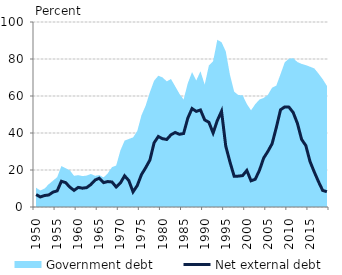
| Category | Net external debt |
|---|---|
| 1950.0 | 6.728 |
| 1951.0 | 5.438 |
| 1952.0 | 6.2 |
| 1953.0 | 6.504 |
| 1954.0 | 8.04 |
| 1955.0 | 8.719 |
| 1956.0 | 13.915 |
| 1957.0 | 13.187 |
| 1958.0 | 10.752 |
| 1959.0 | 8.988 |
| 1960.0 | 10.599 |
| 1961.0 | 10.168 |
| 1962.0 | 10.481 |
| 1963.0 | 12.162 |
| 1964.0 | 14.583 |
| 1965.0 | 15.564 |
| 1966.0 | 13.183 |
| 1967.0 | 13.754 |
| 1968.0 | 13.516 |
| 1969.0 | 10.821 |
| 1970.0 | 12.98 |
| 1971.0 | 16.852 |
| 1972.0 | 14.275 |
| 1973.0 | 8.183 |
| 1974.0 | 11.578 |
| 1975.0 | 17.5 |
| 1976.0 | 21.258 |
| 1977.0 | 25.358 |
| 1978.0 | 34.735 |
| 1979.0 | 38.098 |
| 1980.0 | 36.929 |
| 1981.0 | 36.501 |
| 1982.0 | 39.034 |
| 1983.0 | 40.288 |
| 1984.0 | 39.305 |
| 1985.0 | 39.724 |
| 1986.0 | 48.084 |
| 1987.0 | 53.224 |
| 1988.0 | 51.699 |
| 1989.0 | 52.465 |
| 1990.0 | 47.076 |
| 1991.0 | 45.805 |
| 1992.0 | 40.021 |
| 1993.0 | 46.739 |
| 1994.0 | 51.766 |
| 1995.0 | 32.945 |
| 1996.0 | 24.308 |
| 1997.0 | 16.603 |
| 1998.0 | 16.692 |
| 1999.0 | 16.964 |
| 2000.0 | 19.751 |
| 2001.0 | 14.158 |
| 2002.0 | 15.005 |
| 2003.0 | 19.854 |
| 2004.0 | 26.48 |
| 2005.0 | 30.081 |
| 2006.0 | 34.202 |
| 2007.0 | 42.983 |
| 2008.0 | 52.559 |
| 2009.0 | 54.102 |
| 2010.0 | 53.985 |
| 2011.0 | 51.074 |
| 2012.0 | 45.243 |
| 2013.0 | 36.549 |
| 2014.0 | 33.216 |
| 2015.0 | 24.559 |
| 2016.0 | 18.956 |
| 2017.0 | 13.735 |
| 2018.0 | 8.95 |
| 2019.0 | 8.267 |